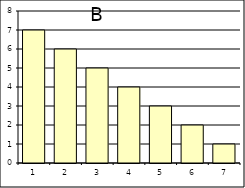
| Category | B |
|---|---|
| 1.0 | 7 |
| 2.0 | 6 |
| 3.0 | 5 |
| 4.0 | 4 |
| 5.0 | 3 |
| 6.0 | 2 |
| 7.0 | 1 |